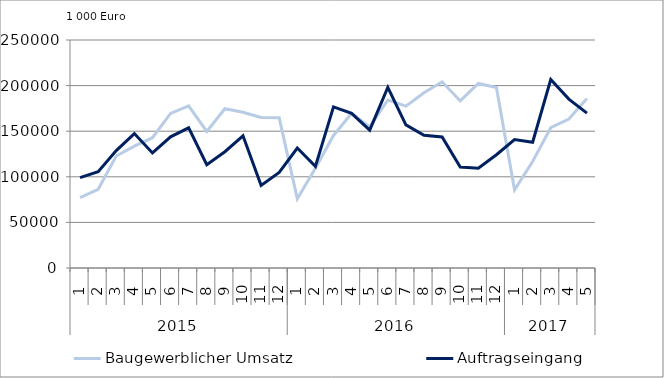
| Category | Baugewerblicher Umsatz | Auftragseingang |
|---|---|---|
| 0 | 77137.228 | 99023.008 |
| 1 | 86257.027 | 105491.844 |
| 2 | 122760.234 | 128704.324 |
| 3 | 133614.814 | 147438.665 |
| 4 | 142869.83 | 126182.175 |
| 5 | 169564.381 | 143879.815 |
| 6 | 177708.819 | 153660.001 |
| 7 | 149762.789 | 113338.261 |
| 8 | 174633.481 | 127520.775 |
| 9 | 170827.145 | 144931.886 |
| 10 | 165122.384 | 90621.16 |
| 11 | 164674.971 | 104795.622 |
| 12 | 76043.538 | 131571.482 |
| 13 | 109483.268 | 111467.248 |
| 14 | 145343.559 | 176673.268 |
| 15 | 169660.551 | 169566.96 |
| 16 | 154554.865 | 151228.165 |
| 17 | 184236.137 | 198035.655 |
| 18 | 177444.278 | 156900.898 |
| 19 | 192230.472 | 145537.167 |
| 20 | 204178.065 | 143616.217 |
| 21 | 183173.849 | 110770.94 |
| 22 | 202302.279 | 109384.188 |
| 23 | 197832.096 | 124193.91 |
| 24 | 85701.947 | 140751.008 |
| 25 | 116743.276 | 137863.383 |
| 26 | 153810.055 | 206710.579 |
| 27 | 163342.989 | 185183.797 |
| 28 | 185946.221 | 169878.51 |